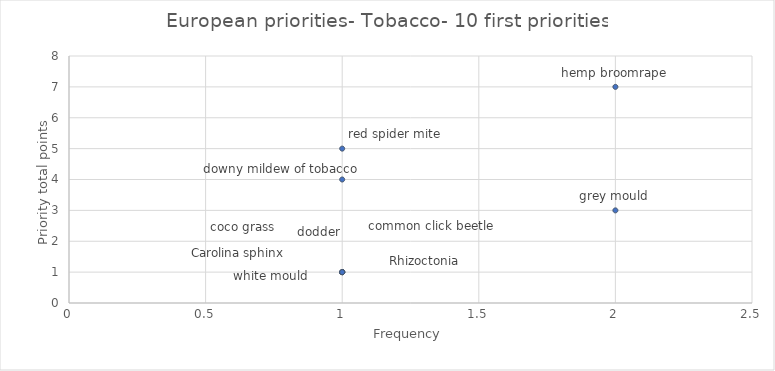
| Category | Series 0 |
|---|---|
| 2.0 | 7 |
| 1.0 | 5 |
| 1.0 | 4 |
| 2.0 | 3 |
| 1.0 | 1 |
| 1.0 | 1 |
| 1.0 | 1 |
| 1.0 | 1 |
| 1.0 | 1 |
| 1.0 | 1 |
| 1.0 | 1 |